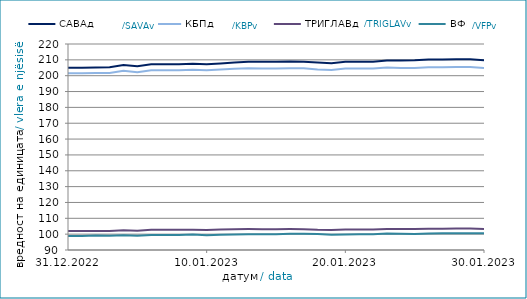
| Category | САВАд | КБПд | ТРИГЛАВд | ВФПд |
|---|---|---|---|---|
| 2022-12-31 | 204.936 | 201.601 | 101.945 | 98.792 |
| 2023-01-01 | 204.943 | 201.608 | 101.949 | 98.797 |
| 2023-01-02 | 205.134 | 201.635 | 101.958 | 99.106 |
| 2023-01-03 | 205.39 | 201.752 | 101.943 | 98.983 |
| 2023-01-04 | 206.724 | 203.049 | 102.475 | 99.318 |
| 2023-01-05 | 205.985 | 202.201 | 102.096 | 99.066 |
| 2023-01-06 | 207.225 | 203.462 | 102.713 | 99.424 |
| 2023-01-07 | 207.232 | 203.47 | 102.716 | 99.43 |
| 2023-01-08 | 207.238 | 203.476 | 102.719 | 99.436 |
| 2023-01-09 | 207.462 | 203.689 | 102.741 | 99.803 |
| 2023-01-10 | 207.242 | 203.512 | 102.675 | 99.385 |
| 2023-01-11 | 207.732 | 203.941 | 102.923 | 99.639 |
| 2023-01-12 | 208.373 | 204.391 | 103.098 | 99.832 |
| 2023-01-13 | 208.794 | 204.675 | 103.215 | 99.976 |
| 2023-01-14 | 208.731 | 204.598 | 103.158 | 100.011 |
| 2023-01-15 | 208.737 | 204.605 | 103.162 | 100.018 |
| 2023-01-16 | 208.887 | 204.627 | 103.177 | 100.181 |
| 2023-01-17 | 208.723 | 204.637 | 103.163 | 100.233 |
| 2023-01-18 | 208.286 | 203.838 | 102.713 | 100.043 |
| 2023-01-19 | 207.924 | 203.59 | 102.556 | 99.593 |
| 2023-01-20 | 208.749 | 204.461 | 102.968 | 99.841 |
| 2023-01-21 | 208.811 | 204.537 | 103.007 | 99.862 |
| 2023-01-22 | 208.818 | 204.544 | 103.011 | 99.869 |
| 2023-01-23 | 209.577 | 205.098 | 103.304 | 100.368 |
| 2023-01-24 | 209.587 | 204.806 | 103.177 | 100.269 |
| 2023-01-25 | 209.766 | 204.927 | 103.268 | 100.026 |
| 2023-01-26 | 210.173 | 205.311 | 103.457 | 100.356 |
| 2023-01-27 | 210.273 | 205.29 | 103.452 | 100.598 |
| 2023-01-28 | 210.42 | 205.457 | 103.536 | 100.637 |
| 2023-01-29 | 210.427 | 205.464 | 103.541 | 100.644 |
| 2023-01-30 | 209.752 | 204.825 | 103.235 | 100.5 |